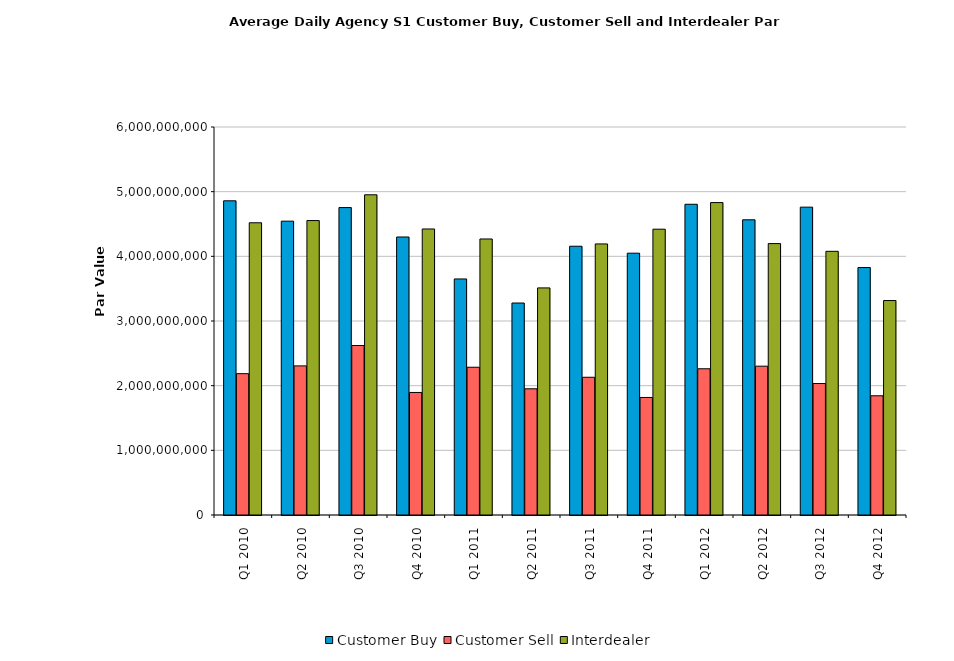
| Category | Customer Buy | Customer Sell | Interdealer |
|---|---|---|---|
| Q1 2010 | 4858619375.474 | 2185588120.792 | 4519073123.667 |
| Q2 2010 | 4543971747.97 | 2305894982.222 | 4553072903.846 |
| Q3 2010 | 4754031557.96 | 2620680990.156 | 4951733425.241 |
| Q4 2010 | 4298988228.978 | 1895014039.473 | 4422971308.328 |
| Q1 2011 | 3650213750.701 | 2284978454.007 | 4268516681.583 |
| Q2 2011 | 3278018479.981 | 1951447853.367 | 3511817513.696 |
| Q3 2011 | 4156019129.176 | 2129817820.81 | 4191803339.987 |
| Q4 2011 | 4048809559.675 | 1817417340.88 | 4419578741.148 |
| Q1 2012 | 4805131828.855 | 2261198234.689 | 4831201719.361 |
| Q2 2012 | 4564915316.16 | 2301348797.814 | 4197235917.869 |
| Q3 2012 | 4760626093.801 | 2033059819.746 | 4077567226.814 |
| Q4 2012 | 3826428782.592 | 1843370485.961 | 3316352390.939 |